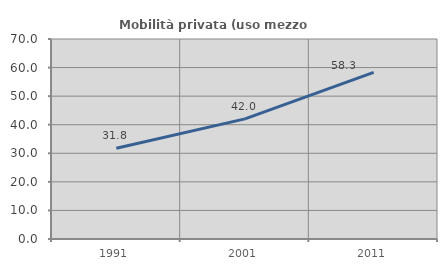
| Category | Mobilità privata (uso mezzo privato) |
|---|---|
| 1991.0 | 31.769 |
| 2001.0 | 42.044 |
| 2011.0 | 58.317 |